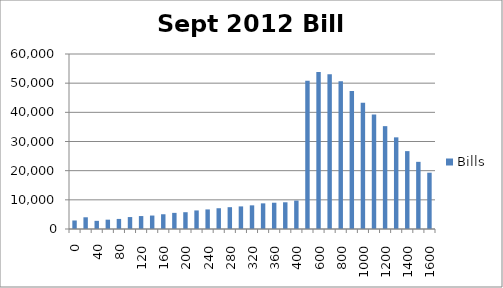
| Category | Bills |
|---|---|
| 0.0 | 2921.283 |
| 20.0 | 4015.31 |
| 40.0 | 2798 |
| 60.0 | 3197.333 |
| 80.0 | 3452.93 |
| 100.0 | 4093.521 |
| 120.0 | 4437.28 |
| 140.0 | 4610.815 |
| 160.0 | 5054.867 |
| 180.0 | 5529.501 |
| 200.0 | 5756.086 |
| 220.0 | 6365.975 |
| 240.0 | 6712.191 |
| 260.0 | 7119.89 |
| 280.0 | 7481.189 |
| 300.0 | 7746.308 |
| 320.0 | 8108.476 |
| 340.0 | 8791.224 |
| 360.0 | 9007.914 |
| 380.0 | 9161.465 |
| 400.0 | 9741.331 |
| 500.0 | 50817.521 |
| 600.0 | 53843.135 |
| 700.0 | 53052.206 |
| 800.0 | 50660.281 |
| 900.0 | 47292.811 |
| 1000.0 | 43286.974 |
| 1100.0 | 39256.027 |
| 1200.0 | 35265.24 |
| 1300.0 | 31423.309 |
| 1400.0 | 26700.545 |
| 1500.0 | 23026.296 |
| 1600.0 | 19303.542 |